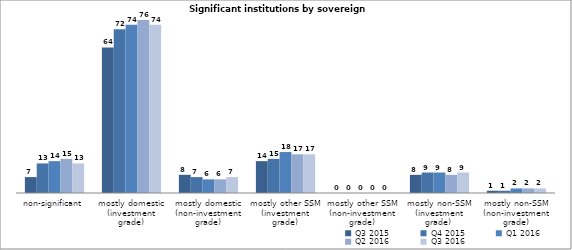
| Category | Q3 2015 | Q4 2015 | Q1 2016 | Q2 2016 | Q3 2016 |
|---|---|---|---|---|---|
| non-significant | 7 | 13 | 14 | 15 | 13 |
| mostly domestic
(investment grade) | 64 | 72 | 74 | 76 | 74 |
| mostly domestic
(non-investment grade) | 8 | 7 | 6 | 6 | 7 |
| mostly other SSM
(investment grade) | 14 | 15 | 18 | 17 | 17 |
| mostly other SSM
(non-investment grade) | 0 | 0 | 0 | 0 | 0 |
| mostly non-SSM
(investment grade)  | 8 | 9 | 9 | 8 | 9 |
| mostly non-SSM
(non-investment grade) | 1 | 1 | 2 | 2 | 2 |